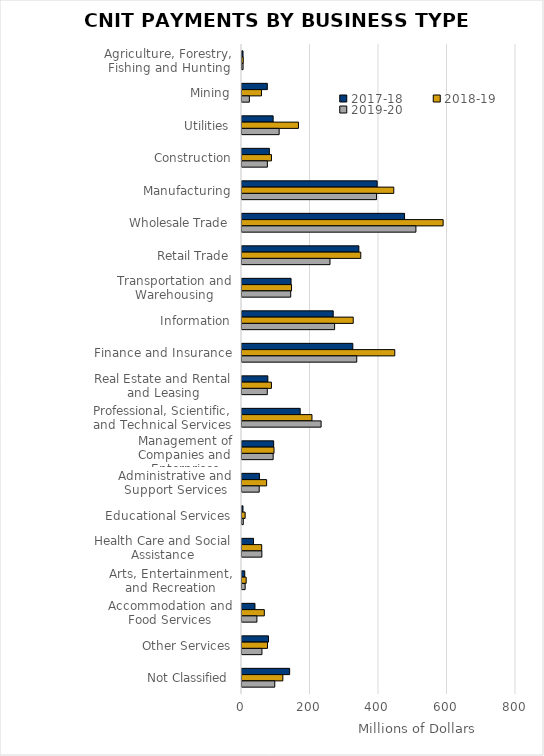
| Category | 2017-18 | 2018-19 | 2019-20 |
|---|---|---|---|
| Agriculture, Forestry, Fishing and Hunting | 3.01 | 3.682 | 3.1 |
| Mining | 73.936 | 56.905 | 21.5 |
| Utilities | 90.955 | 164.895 | 108.5 |
| Construction | 79.905 | 86.013 | 74.1 |
| Manufacturing | 394.681 | 443.157 | 392.9 |
| Wholesale Trade | 474.653 | 587.276 | 507.8 |
| Retail Trade | 341.208 | 346.771 | 256.9 |
| Transportation and Warehousing | 143.236 | 144.619 | 142.2 |
| Information | 266.341 | 324.8 | 270.4 |
| Finance and Insurance | 323.545 | 446.046 | 335 |
| Real Estate and Rental and Leasing | 75.437 | 85.911 | 73.9 |
| Professional, Scientific, and Technical Services | 169.869 | 204.25 | 231 |
| Management of Companies and Enterprises | 92.508 | 93.468 | 91 |
| Administrative and Support Services | 50.948 | 71.935 | 50.3 |
| Educational Services | 2.9 | 9.142 | 3.8 |
| Health Care and Social Assistance | 33.576 | 57.559 | 58 |
| Arts, Entertainment, and Recreation | 8.039 | 12.178 | 9.2 |
| Accommodation and Food Services | 37.855 | 65.171 | 43.5 |
| Other Services | 77.351 | 74.478 | 58.2 |
| Not Classified | 139.071 | 119.286 | 95.7 |